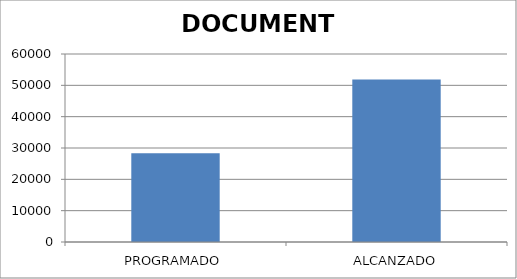
| Category | DOCUMENTO |
|---|---|
| PROGRAMADO | 28330 |
| ALCANZADO | 51831 |